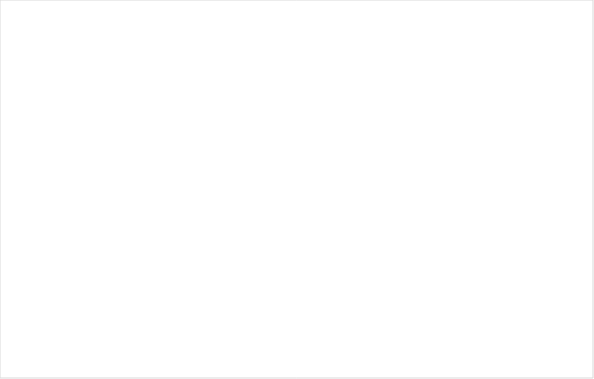
| Category | Ingen brist | Föreläggande | Föreläggande vid vite | Anmärkning | Avstående från ingripande |
|---|---|---|---|---|---|
| Enskild en enhet | 0.75 | 0.154 | 0.077 | 0.019 | 0 |
| Enskild flera enhet | 0.824 | 0.122 | 0.027 | 0.014 | 0.014 |
| Offentlig | 0.729 | 0.226 | 0.04 | 0.005 | 0 |